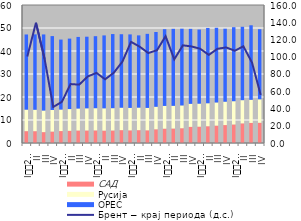
| Category | САД | Русија | OPEC |
|---|---|---|---|
| I
2008. | 5.153 | 9.351 | 32.683 |
| II | 5.145 | 9.315 | 32.782 |
| III | 4.73 | 9.386 | 33.086 |
| IV | 4.976 | 9.374 | 32.137 |
| I
2009. | 5.189 | 9.355 | 30.431 |
| II | 5.308 | 9.448 | 30.632 |
| III | 5.444 | 9.543 | 31.133 |
| IV | 5.454 | 9.632 | 31.131 |
| I
2010. | 5.486 | 9.649 | 31.31 |
| II | 5.392 | 9.688 | 31.696 |
| III | 5.454 | 9.686 | 32.231 |
| IV | 5.594 | 9.753 | 31.947 |
| I
2011. | 5.501 | 9.765 | 31.956 |
| II | 5.586 | 9.795 | 31.41 |
| III | 5.52 | 9.744 | 32.196 |
| IV | 5.969 | 9.791 | 32.508 |
| I
2012. | 6.237 | 9.891 | 33.361 |
| II | 6.297 | 9.868 | 33.471 |
| III | 6.426 | 9.91 | 33.355 |
| IV | 7.022 | 10.016 | 32.586 |
| I
2013. | 7.111 | 9.993 | 32.22 |
| II | 7.292 | 9.992 | 32.734 |
| III | 7.56 | 10.066 | 32.47 |
| IV | 7.794 | 10.162 | 31.732 |
| I
2014. | 8.06 | 10.114 | 32.182 |
| II | 8.541 | 10.087 | 31.907 |
| III | 8.735 | 10.046 | 32.404 |
| IV | 8.8 | 10.2 | 30.475 |